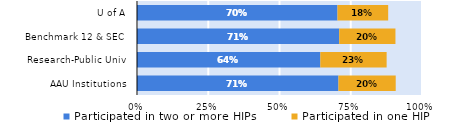
| Category | Participated in two or more HIPs | Participated in one HIP |
|---|---|---|
| AAU Institutions | 0.707 | 0.201 |
| Research-Public Univ | 0.643 | 0.233 |
| Benchmark 12 & SEC | 0.71 | 0.197 |
| U of A | 0.703 | 0.178 |